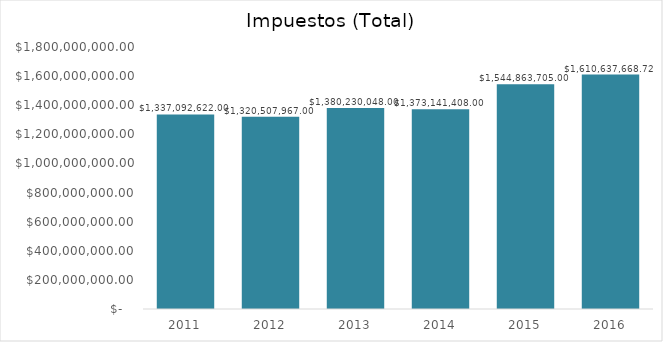
| Category | Impuestos (total) |
|---|---|
| 2011.0 | 1337092622 |
| 2012.0 | 1320507967 |
| 2013.0 | 1380230048 |
| 2014.0 | 1373141408 |
| 2015.0 | 1544863705 |
| 2016.0 | 1610637668.72 |